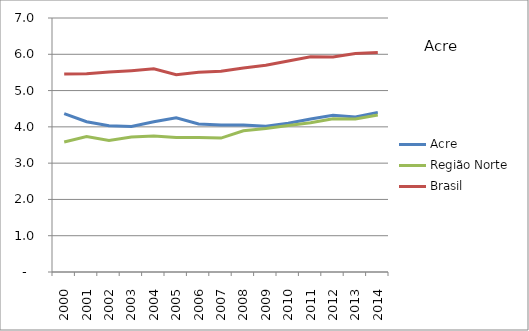
| Category | Acre | Região Norte | Brasil |
|---|---|---|---|
| 2000.0 | 4.367 | 3.584 | 5.458 |
| 2001.0 | 4.143 | 3.732 | 5.467 |
| 2002.0 | 4.031 | 3.625 | 5.513 |
| 2003.0 | 4.012 | 3.72 | 5.549 |
| 2004.0 | 4.139 | 3.745 | 5.599 |
| 2005.0 | 4.25 | 3.709 | 5.438 |
| 2006.0 | 4.08 | 3.704 | 5.507 |
| 2007.0 | 4.051 | 3.69 | 5.531 |
| 2008.0 | 4.05 | 3.894 | 5.623 |
| 2009.0 | 4.016 | 3.953 | 5.699 |
| 2010.0 | 4.097 | 4.037 | 5.816 |
| 2011.0 | 4.217 | 4.116 | 5.93 |
| 2012.0 | 4.318 | 4.224 | 5.928 |
| 2013.0 | 4.273 | 4.216 | 6.021 |
| 2014.0 | 4.399 | 4.325 | 6.051 |